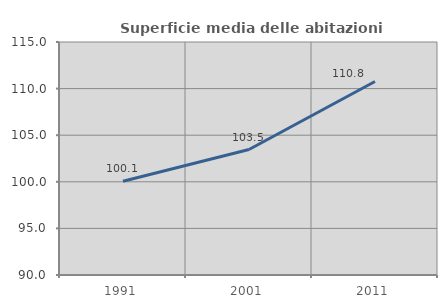
| Category | Superficie media delle abitazioni occupate |
|---|---|
| 1991.0 | 100.053 |
| 2001.0 | 103.462 |
| 2011.0 | 110.766 |